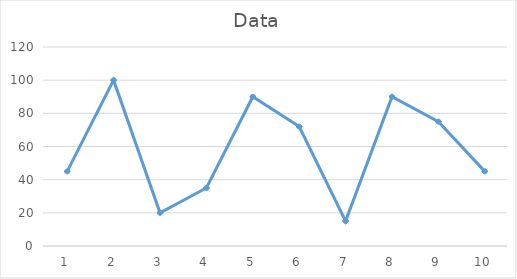
| Category | Data |
|---|---|
| 0 | 45 |
| 1 | 100 |
| 2 | 20 |
| 3 | 35 |
| 4 | 90 |
| 5 | 72 |
| 6 | 15 |
| 7 | 90 |
| 8 | 75 |
| 9 | 45 |